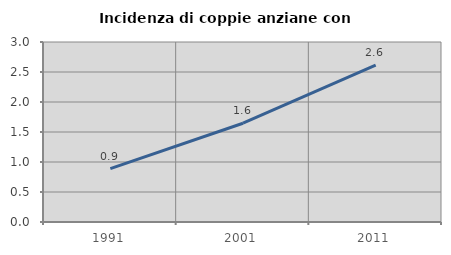
| Category | Incidenza di coppie anziane con figli |
|---|---|
| 1991.0 | 0.889 |
| 2001.0 | 1.646 |
| 2011.0 | 2.614 |